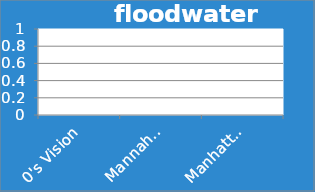
| Category | floodwaters |
|---|---|
| 0's Vision | 0 |
| Mannahatta (1609) | 0 |
| Manhattan (2010) | 0 |